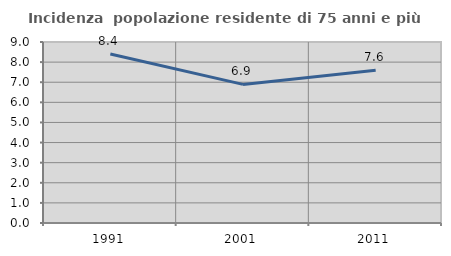
| Category | Incidenza  popolazione residente di 75 anni e più |
|---|---|
| 1991.0 | 8.405 |
| 2001.0 | 6.892 |
| 2011.0 | 7.598 |